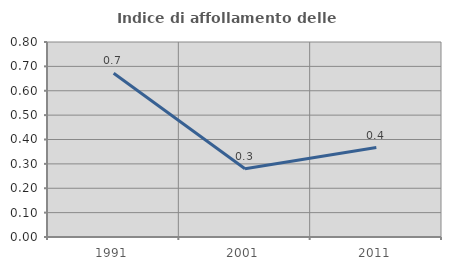
| Category | Indice di affollamento delle abitazioni  |
|---|---|
| 1991.0 | 0.672 |
| 2001.0 | 0.28 |
| 2011.0 | 0.367 |